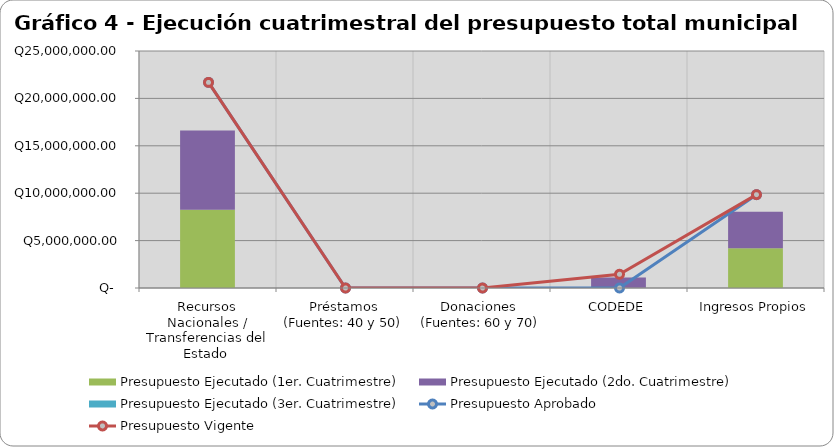
| Category | Presupuesto Ejecutado (1er. Cuatrimestre) | Presupuesto Ejecutado (2do. Cuatrimestre) | Presupuesto Ejecutado (3er. Cuatrimestre) |
|---|---|---|---|
| Recursos Nacionales / Transferencias del Estado  | 8241780.35 | 8369737.6 | 0 |
| Préstamos (Fuentes: 40 y 50) | 0 | 0 | 0 |
| Donaciones  (Fuentes: 60 y 70) | 0 | 0 | 0 |
| CODEDE | 28960.4 | 1066018 | 0 |
| Ingresos Propios | 4182468.42 | 3869945.65 | 0 |